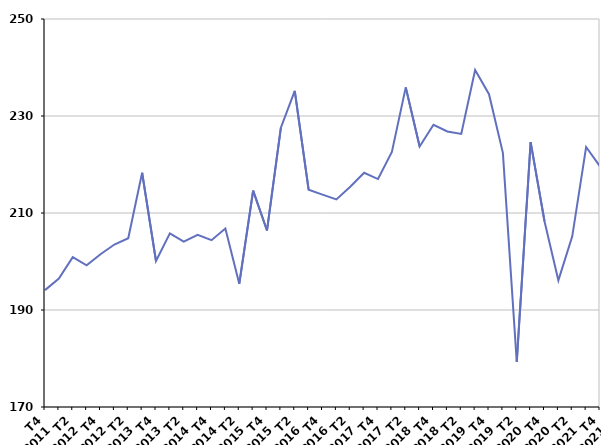
| Category | Cessation d'inscription pour défaut d'actualisation |
|---|---|
| T4
2011 | 194.1 |
| T1
2012 | 196.5 |
| T2
2012 | 200.9 |
| T3
2012 | 199.2 |
| T4
2012 | 201.5 |
| T1
2013 | 203.5 |
| T2
2013 | 204.8 |
| T3
2013 | 218.3 |
| T4
2013 | 200.1 |
| T1
2014 | 205.8 |
| T2
2014 | 204.1 |
| T3
2014 | 205.5 |
| T4
2014 | 204.4 |
| T1
2015 | 206.8 |
| T2
2015 | 195.4 |
| T3
2015 | 214.6 |
| T4
2015 | 206.4 |
| T1
2016 | 227.6 |
| T2
2016 | 235.2 |
| T3
2016 | 214.8 |
| T4
2016 | 213.8 |
| T1
2017 | 212.8 |
| T2
2017 | 215.4 |
| T3
2017 | 218.3 |
| T4
2017 | 217 |
| T1
2018 | 222.6 |
| T2
2018 | 235.9 |
| T3
2018 | 223.7 |
| T4
2018 | 228.2 |
| T1
2019 | 226.8 |
| T2
2019 | 226.3 |
| T3
2019 | 239.5 |
| T4
2019 | 234.5 |
| T1
2020 | 222.4 |
| T2
2020 | 179.3 |
| T3
2020 | 224.6 |
| T4
2020 | 208.3 |
| T1
2021 | 196.1 |
| T2
2021 | 205.2 |
| T3
2021 | 223.6 |
| T4
2021 | 219.6 |